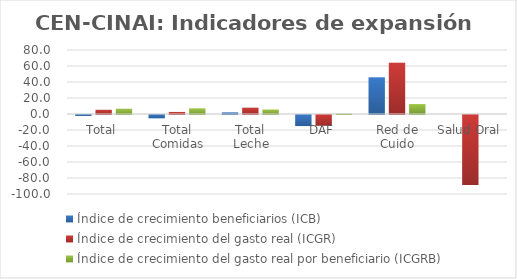
| Category | Índice de crecimiento beneficiarios (ICB)  | Índice de crecimiento del gasto real (ICGR)  | Índice de crecimiento del gasto real por beneficiario (ICGRB)  |
|---|---|---|---|
| Total | -1.192 | 5.235 | 6.505 |
| Total Comidas | -4.211 | 2.572 | 7.081 |
| Total Leche | 2.108 | 7.863 | 5.636 |
| DAF | -13.856 | -13.505 | 0.407 |
| Red de Cuido | 45.885 | 63.999 | 12.416 |
| Salud Oral | 0 | -87.452 | 0 |